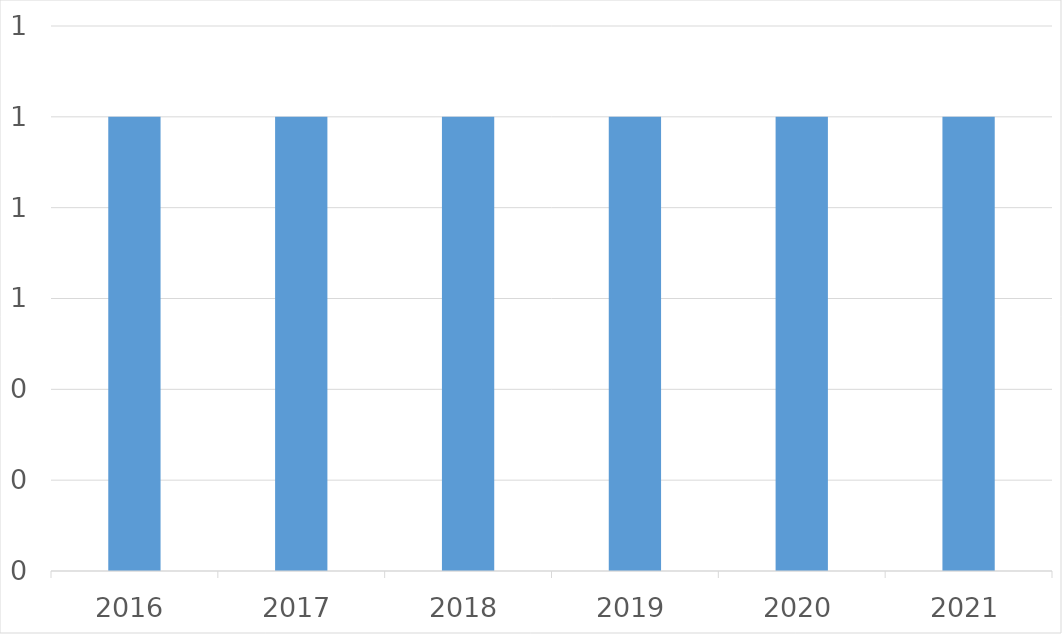
| Category | Series 0 |
|---|---|
| 2016 | 1 |
| 2017 | 1 |
| 2018 | 1 |
| 2019 | 1 |
| 2020 | 1 |
| 2021 | 1 |